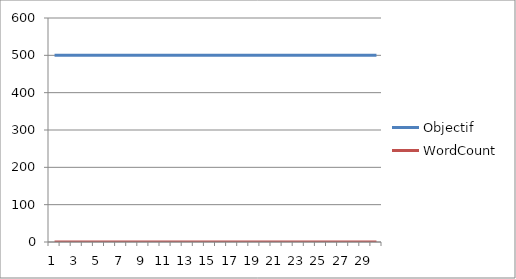
| Category | Objectif | WordCount |
|---|---|---|
| 0 | 500 | 0 |
| 1 | 500 | 0 |
| 2 | 500 | 0 |
| 3 | 500 | 0 |
| 4 | 500 | 0 |
| 5 | 500 | 0 |
| 6 | 500 | 0 |
| 7 | 500 | 0 |
| 8 | 500 | 0 |
| 9 | 500 | 0 |
| 10 | 500 | 0 |
| 11 | 500 | 0 |
| 12 | 500 | 0 |
| 13 | 500 | 0 |
| 14 | 500 | 0 |
| 15 | 500 | 0 |
| 16 | 500 | 0 |
| 17 | 500 | 0 |
| 18 | 500 | 0 |
| 19 | 500 | 0 |
| 20 | 500 | 0 |
| 21 | 500 | 0 |
| 22 | 500 | 0 |
| 23 | 500 | 0 |
| 24 | 500 | 0 |
| 25 | 500 | 0 |
| 26 | 500 | 0 |
| 27 | 500 | 0 |
| 28 | 500 | 0 |
| 29 | 500 | 0 |